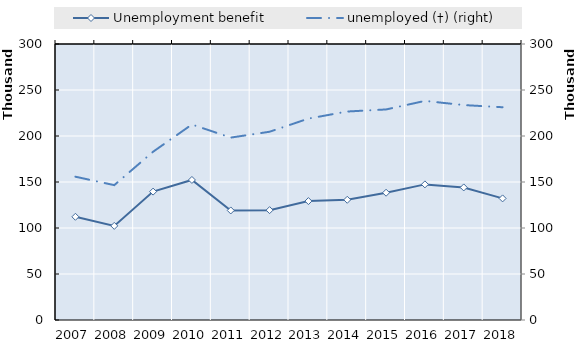
| Category | Survivors' pension from occupational accident insurance | 0 | Series 14 | Series 15 | Series 16 | Series 17 | Series 18 | Series 19 | Unemployment benefit | Series 1 |
|---|---|---|---|---|---|---|---|---|---|---|
| 2007.0 |  |  |  |  |  |  |  |  | 112184 |  |
| 2008.0 |  |  |  |  |  |  |  |  | 102304 |  |
| 2009.0 |  |  |  |  |  |  |  |  | 139546 |  |
| 2010.0 |  |  |  |  |  |  |  |  | 152222 |  |
| 2011.0 |  |  |  |  |  |  |  |  | 119083 |  |
| 2012.0 |  |  |  |  |  |  |  |  | 119409 |  |
| 2013.0 |  |  |  |  |  |  |  |  | 129252.167 |  |
| 2014.0 |  |  |  |  |  |  |  |  | 130659 |  |
| 2015.0 |  |  |  |  |  |  |  |  | 138342.667 |  |
| 2016.0 |  |  |  |  |  |  |  |  | 147403.667 |  |
| 2017.0 |  |  |  |  |  |  |  |  | 144101.583 |  |
| 2018.0 |  |  |  |  |  |  |  |  | 132175 |  |